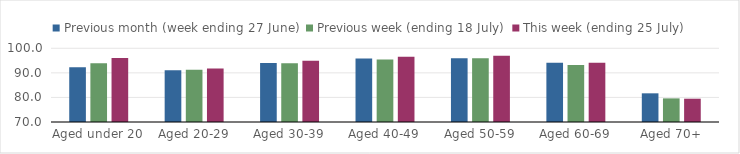
| Category | Previous month (week ending 27 June) | Previous week (ending 18 July) | This week (ending 25 July) |
|---|---|---|---|
| Aged under 20 | 92.291 | 93.932 | 96.081 |
| Aged 20-29 | 91.087 | 91.268 | 91.807 |
| Aged 30-39 | 93.984 | 93.927 | 94.963 |
| Aged 40-49 | 95.795 | 95.403 | 96.542 |
| Aged 50-59 | 95.909 | 95.977 | 96.977 |
| Aged 60-69 | 94.118 | 93.153 | 94.133 |
| Aged 70+ | 81.671 | 79.611 | 79.483 |